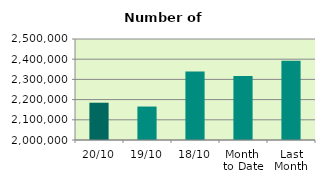
| Category | Series 0 |
|---|---|
| 20/10 | 2184576 |
| 19/10 | 2165672 |
| 18/10 | 2339540 |
| Month 
to Date | 2316961.429 |
| Last
Month | 2392468.182 |